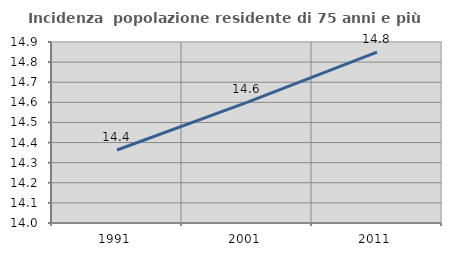
| Category | Incidenza  popolazione residente di 75 anni e più |
|---|---|
| 1991.0 | 14.363 |
| 2001.0 | 14.6 |
| 2011.0 | 14.85 |